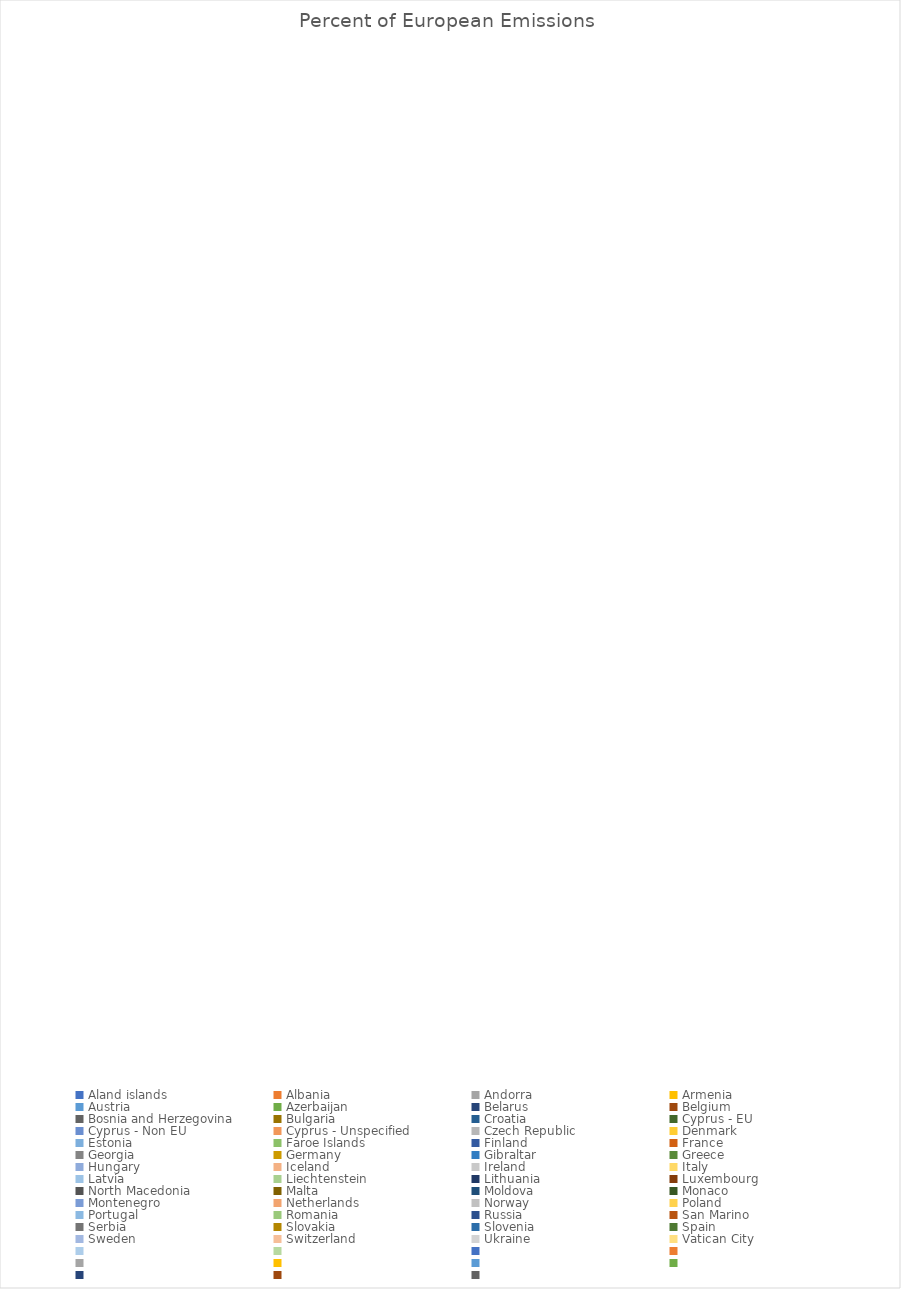
| Category | Percent of European Emissions  |
|---|---|
| Aland islands | 0 |
| Albania | 0 |
| Andorra | 0 |
| Armenia | 0 |
| Austria | 0 |
| Azerbaijan | 0 |
| Belarus | 0 |
| Belgium | 0 |
| Bosnia and Herzegovina | 0 |
| Bulgaria | 0 |
| Croatia | 0 |
| Cyprus - EU | 0 |
| Cyprus - Non EU | 0 |
| Cyprus - Unspecified | 0 |
| Czech Republic | 0 |
| Denmark | 0 |
| Estonia | 0 |
| Faroe Islands | 0 |
| Finland | 0 |
| France | 0 |
| Georgia | 0 |
| Germany | 0 |
| Gibraltar | 0 |
| Greece | 0 |
| Hungary | 0 |
| Iceland | 0 |
| Ireland | 0 |
| Italy | 0 |
| Latvia | 0 |
| Liechtenstein | 0 |
| Lithuania | 0 |
| Luxembourg | 0 |
| North Macedonia | 0 |
| Malta | 0 |
| Moldova | 0 |
| Monaco | 0 |
| Montenegro | 0 |
| Netherlands | 0 |
| Norway | 0 |
| Poland | 0 |
| Portugal | 0 |
| Romania | 0 |
| Russia | 0 |
| San Marino | 0 |
| Serbia | 0 |
| Slovakia | 0 |
| Slovenia | 0 |
| Spain | 0 |
| Sweden | 0 |
| Switzerland | 0 |
| Ukraine | 0 |
| Vatican City | 0 |